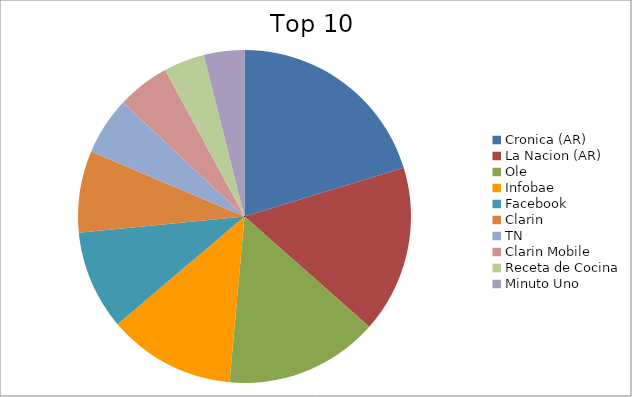
| Category | Series 0 |
|---|---|
| Cronica (AR) | 9.68 |
| La Nacion (AR) | 7.75 |
| Ole | 7.12 |
| Infobae | 5.9 |
| Facebook | 4.6 |
| Clarin | 3.79 |
| TN | 2.68 |
| Clarin Mobile | 2.44 |
| Receta de Cocina | 1.89 |
| Minuto Uno | 1.88 |